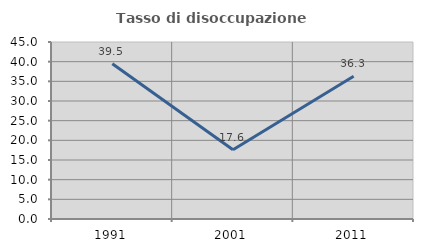
| Category | Tasso di disoccupazione giovanile  |
|---|---|
| 1991.0 | 39.465 |
| 2001.0 | 17.6 |
| 2011.0 | 36.283 |